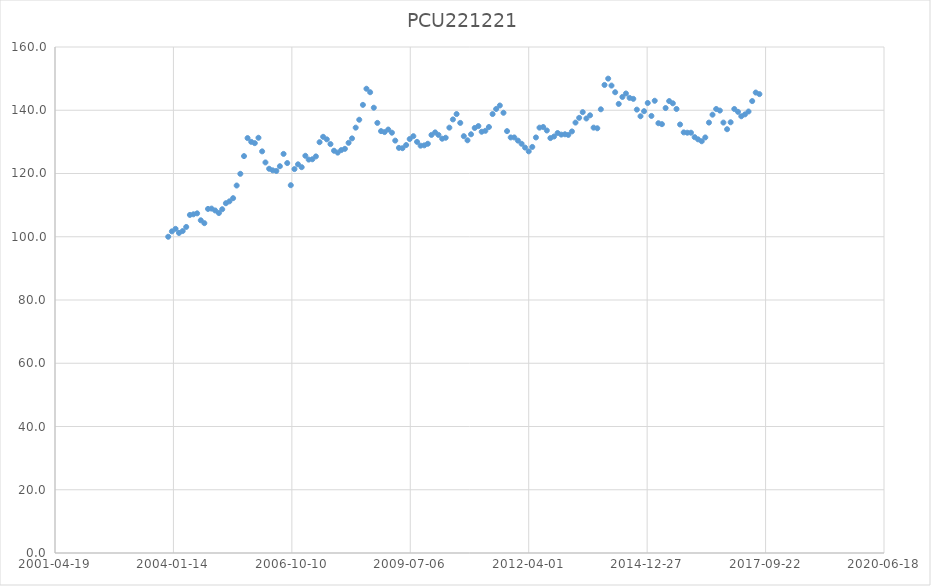
| Category | PCU221221 |
|---|---|
| 37956.0 | 100 |
| 37987.0 | 101.7 |
| 38018.0 | 102.5 |
| 38047.0 | 101.2 |
| 38078.0 | 101.8 |
| 38108.0 | 103.1 |
| 38139.0 | 106.9 |
| 38169.0 | 107.1 |
| 38200.0 | 107.4 |
| 38231.0 | 105.2 |
| 38261.0 | 104.3 |
| 38292.0 | 108.8 |
| 38322.0 | 108.9 |
| 38353.0 | 108.3 |
| 38384.0 | 107.5 |
| 38412.0 | 108.7 |
| 38443.0 | 110.6 |
| 38473.0 | 111.2 |
| 38504.0 | 112.2 |
| 38534.0 | 116.2 |
| 38565.0 | 119.9 |
| 38596.0 | 125.5 |
| 38626.0 | 131.2 |
| 38657.0 | 130 |
| 38687.0 | 129.6 |
| 38718.0 | 131.3 |
| 38749.0 | 127 |
| 38777.0 | 123.5 |
| 38808.0 | 121.5 |
| 38838.0 | 121 |
| 38869.0 | 120.8 |
| 38899.0 | 122.3 |
| 38930.0 | 126.2 |
| 38961.0 | 123.3 |
| 38991.0 | 116.3 |
| 39022.0 | 121.4 |
| 39052.0 | 122.9 |
| 39083.0 | 122 |
| 39114.0 | 125.6 |
| 39142.0 | 124.4 |
| 39173.0 | 124.5 |
| 39203.0 | 125.4 |
| 39234.0 | 129.9 |
| 39264.0 | 131.6 |
| 39295.0 | 130.8 |
| 39326.0 | 129.3 |
| 39356.0 | 127.2 |
| 39387.0 | 126.6 |
| 39417.0 | 127.4 |
| 39448.0 | 127.8 |
| 39479.0 | 129.7 |
| 39508.0 | 131.1 |
| 39539.0 | 134.5 |
| 39569.0 | 137 |
| 39600.0 | 141.7 |
| 39630.0 | 146.8 |
| 39661.0 | 145.7 |
| 39692.0 | 140.8 |
| 39722.0 | 136 |
| 39753.0 | 133.4 |
| 39783.0 | 133.1 |
| 39814.0 | 133.9 |
| 39845.0 | 132.9 |
| 39873.0 | 130.4 |
| 39904.0 | 128.1 |
| 39934.0 | 128 |
| 39965.0 | 129 |
| 39995.0 | 130.9 |
| 40026.0 | 131.8 |
| 40057.0 | 130 |
| 40087.0 | 128.8 |
| 40118.0 | 128.9 |
| 40148.0 | 129.4 |
| 40179.0 | 132.2 |
| 40210.0 | 133 |
| 40238.0 | 132.2 |
| 40269.0 | 131 |
| 40299.0 | 131.3 |
| 40330.0 | 134.5 |
| 40360.0 | 137.1 |
| 40391.0 | 138.8 |
| 40422.0 | 136 |
| 40452.0 | 131.8 |
| 40483.0 | 130.5 |
| 40513.0 | 132.4 |
| 40544.0 | 134.4 |
| 40575.0 | 135 |
| 40603.0 | 133.2 |
| 40634.0 | 133.5 |
| 40664.0 | 134.7 |
| 40695.0 | 138.8 |
| 40725.0 | 140.4 |
| 40756.0 | 141.5 |
| 40787.0 | 139.2 |
| 40817.0 | 133.4 |
| 40848.0 | 131.4 |
| 40878.0 | 131.4 |
| 40909.0 | 130.4 |
| 40940.0 | 129.4 |
| 40969.0 | 128.2 |
| 41000.0 | 127 |
| 41030.0 | 128.4 |
| 41061.0 | 131.4 |
| 41091.0 | 134.5 |
| 41122.0 | 134.7 |
| 41153.0 | 133.6 |
| 41183.0 | 131.2 |
| 41214.0 | 131.7 |
| 41244.0 | 132.8 |
| 41275.0 | 132.3 |
| 41306.0 | 132.4 |
| 41334.0 | 132.2 |
| 41365.0 | 133.3 |
| 41395.0 | 136.1 |
| 41426.0 | 137.6 |
| 41456.0 | 139.4 |
| 41487.0 | 137.4 |
| 41518.0 | 138.4 |
| 41548.0 | 134.5 |
| 41579.0 | 134.3 |
| 41609.0 | 140.3 |
| 41640.0 | 148 |
| 41671.0 | 150 |
| 41699.0 | 147.8 |
| 41730.0 | 145.7 |
| 41760.0 | 142 |
| 41791.0 | 144.2 |
| 41821.0 | 145.3 |
| 41852.0 | 143.9 |
| 41883.0 | 143.6 |
| 41913.0 | 140.2 |
| 41944.0 | 138.1 |
| 41974.0 | 139.7 |
| 42005.0 | 142.3 |
| 42036.0 | 138.2 |
| 42064.0 | 143 |
| 42095.0 | 135.9 |
| 42125.0 | 135.6 |
| 42156.0 | 140.7 |
| 42186.0 | 142.9 |
| 42217.0 | 142.2 |
| 42248.0 | 140.4 |
| 42278.0 | 135.5 |
| 42309.0 | 133 |
| 42339.0 | 132.9 |
| 42370.0 | 132.9 |
| 42401.0 | 131.5 |
| 42430.0 | 130.8 |
| 42461.0 | 130.2 |
| 42491.0 | 131.4 |
| 42522.0 | 136.1 |
| 42552.0 | 138.6 |
| 42583.0 | 140.4 |
| 42614.0 | 139.9 |
| 42644.0 | 136.1 |
| 42675.0 | 134 |
| 42705.0 | 136.2 |
| 42736.0 | 140.4 |
| 42767.0 | 139.5 |
| 42795.0 | 138.1 |
| 42826.0 | 138.7 |
| 42856.0 | 139.6 |
| 42887.0 | 142.9 |
| 42917.0 | 145.6 |
| 42948.0 | 145.1 |